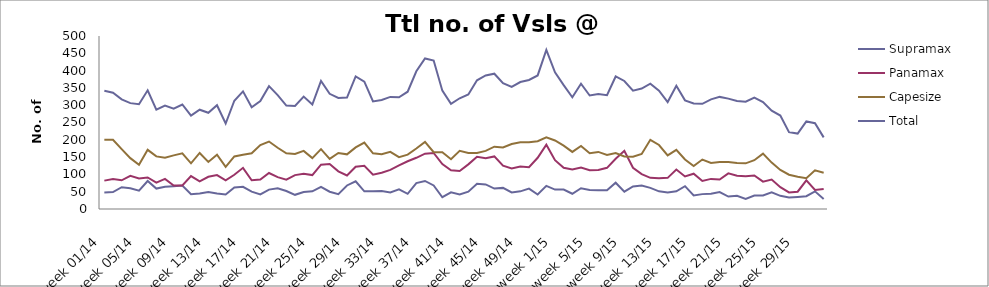
| Category | Supramax | Panamax | Capesize | Total |
|---|---|---|---|---|
| week 01/14 | 48 | 82 | 200 | 342 |
| week 02/14 | 49 | 87 | 200 | 336 |
| week 03/14 | 63 | 83 | 173 | 317 |
| week 04/14 | 60 | 96 | 147 | 306 |
| week 05/14 | 53 | 88 | 128 | 303 |
| week 06/14 | 81 | 91 | 171 | 343 |
| week 07/14 | 59 | 76 | 152 | 287 |
| week 08/14 | 64 | 87 | 148 | 299 |
| week 09/14 | 66 | 68 | 155 | 290 |
| week 10/14 | 68 | 68 | 161 | 302 |
| week 11/14 | 43 | 95 | 132 | 270 |
| week 12/14 | 45 | 80 | 162 | 287 |
| week 13/14 | 49 | 93 | 136 | 278 |
| week 14/14 | 45 | 98 | 157 | 300 |
| week 15/14 | 42 | 83 | 122 | 247 |
| week 16/14 | 62 | 99 | 152 | 313 |
| week 17/14 | 64 | 119 | 157 | 340 |
| week 18/14 | 50 | 83 | 161 | 294 |
| week 19/14 | 42 | 85 | 185 | 312 |
| week 20/14 | 56 | 104 | 195 | 355 |
| week 21/14 | 60 | 92 | 177 | 329 |
| week 22/14 | 52 | 85 | 161 | 299 |
| week 23/14 | 41 | 98 | 159 | 298 |
| week 24/14 | 49 | 102 | 168 | 325 |
| week 25/14 | 51 | 98 | 147 | 302 |
| week 26/14 | 64 | 128 | 173 | 370 |
| week 27/14 | 50 | 130 | 145 | 333 |
| week 28/14 | 43 | 109 | 162 | 321 |
| week 29/14 | 68 | 97 | 158 | 322 |
| week 30/14 | 80 | 122 | 178 | 383 |
| week 31/14 | 51 | 125 | 192 | 368 |
| week 32/14 | 51 | 99 | 161 | 311 |
| week 33/14 | 52 | 105 | 158 | 315 |
| week 34/14 | 48 | 113 | 165 | 324 |
| week 35/14 | 57 | 126 | 150 | 323 |
| week 36/14 | 44 | 138 | 157 | 339 |
| week 37/14 | 75 | 148 | 175 | 398 |
| week 38/14 | 81 | 160 | 194 | 435 |
| week 39/14 | 68 | 162 | 164 | 429 |
| week 40/14 | 34 | 130 | 164 | 342 |
| week 41/14 | 48 | 112 | 144 | 304 |
| week 42/14 | 42 | 110 | 168 | 320 |
| week 43/14 | 50 | 129 | 162 | 331 |
| week 44/14 | 73 | 151 | 162 | 372 |
| week 45/14 | 71 | 147 | 168 | 386 |
| week 46/14 | 59 | 152 | 180 | 391 |
| week 47/14 | 61 | 125 | 178 | 364 |
| week 48/14 | 48 | 117 | 188 | 353 |
| week 49/14 | 51 | 123 | 193 | 367 |
| week 50/14 | 59 | 121 | 193 | 373 |
| week 51/14 | 42 | 148 | 196 | 386 |
| week 52/14 | 67 | 186 | 207 | 460 |
| week 1/15 | 56 | 141 | 198 | 395 |
| week 2/15 | 56 | 119 | 183 | 358 |
| week 3/15 | 44 | 114 | 165 | 323 |
| week 4/15 | 60 | 120 | 182 | 362 |
| week 5/15 | 55 | 112 | 161 | 328 |
| week 6/15 | 54 | 113 | 165 | 332 |
| week 7/15 | 54 | 119 | 156 | 329 |
| week 8/15 | 76 | 145 | 162 | 383 |
| week 9/15 | 50 | 168 | 152 | 370 |
| week 10/15 | 65 | 119 | 151 | 342 |
| week 11/15 | 68 | 101 | 159 | 348 |
| week 12/15 | 61 | 90 | 200 | 362 |
| week 13/15 | 51 | 89 | 185 | 342 |
| week 14/15 | 48 | 90 | 155 | 309 |
| week 15/15 | 51 | 114 | 171 | 356 |
| week 16/15 | 66 | 94 | 143 | 314 |
| week 17/15 | 39 | 102 | 124 | 305 |
| week 18/15 | 43 | 81 | 143 | 304 |
| week 19/15 | 44 | 87 | 133 | 317 |
| week 20/15 | 49 | 85 | 136 | 324 |
| week 21/15 | 36 | 103 | 136 | 319 |
| week 22/15 | 38 | 96 | 133 | 312 |
| week 23/15 | 29 | 95 | 132 | 310 |
| week 24/15 | 39 | 97 | 141 | 322 |
| week 25/15 | 39 | 79 | 160 | 309 |
| week 26/15 | 48 | 85 | 134 | 284 |
| week 27/15 | 38 | 63 | 113 | 270 |
| week 28/15 | 33 | 48 | 99 | 222 |
| week 29/15 | 35 | 50 | 93 | 218 |
| week 30/15 | 37 | 83 | 89 | 253 |
| week 31/15 | 51 | 55 | 112 | 248 |